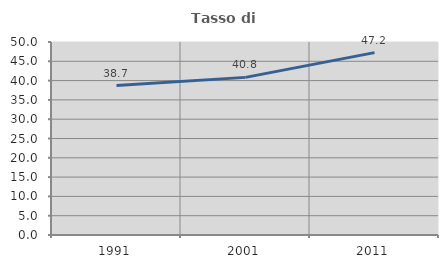
| Category | Tasso di occupazione   |
|---|---|
| 1991.0 | 38.718 |
| 2001.0 | 40.835 |
| 2011.0 | 47.243 |